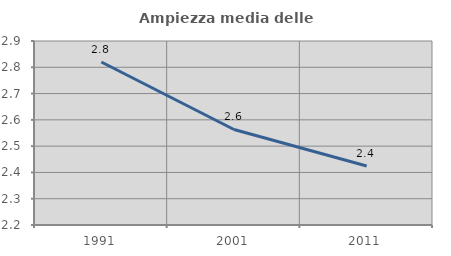
| Category | Ampiezza media delle famiglie |
|---|---|
| 1991.0 | 2.82 |
| 2001.0 | 2.563 |
| 2011.0 | 2.425 |